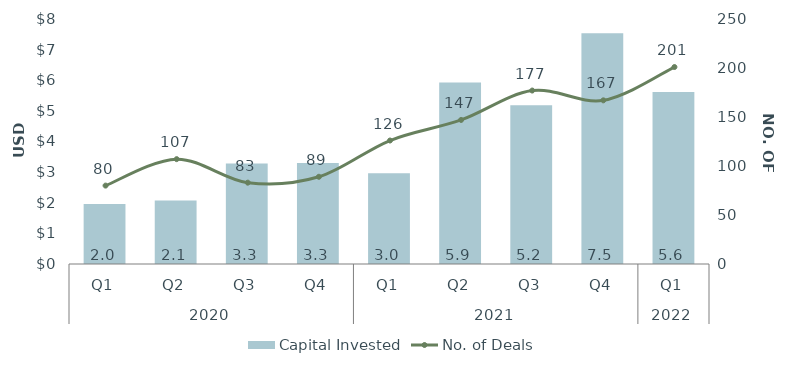
| Category | Capital Invested |
|---|---|
| 0 | 1.961 |
| 1 | 2.074 |
| 2 | 3.282 |
| 3 | 3.296 |
| 4 | 2.962 |
| 5 | 5.923 |
| 6 | 5.188 |
| 7 | 7.534 |
| 8 | 5.62 |